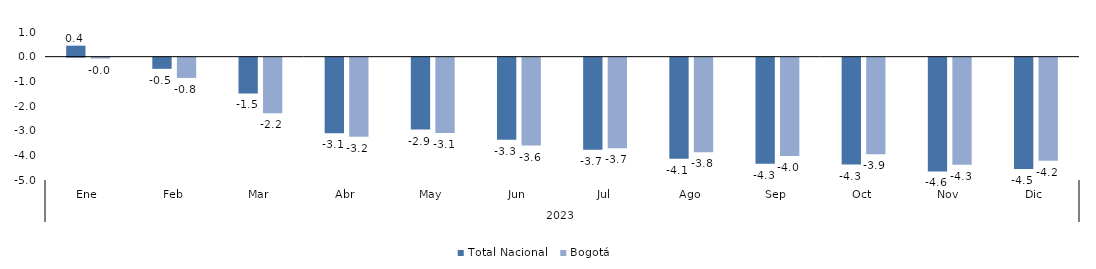
| Category | Total Nacional | Bogotá |
|---|---|---|
| 0 | 0.446 | -0.036 |
| 1 | -0.453 | -0.821 |
| 2 | -1.453 | -2.248 |
| 3 | -3.064 | -3.206 |
| 4 | -2.914 | -3.05 |
| 5 | -3.33 | -3.565 |
| 6 | -3.733 | -3.673 |
| 7 | -4.094 | -3.838 |
| 8 | -4.3 | -3.985 |
| 9 | -4.334 | -3.913 |
| 10 | -4.613 | -4.346 |
| 11 | -4.518 | -4.181 |